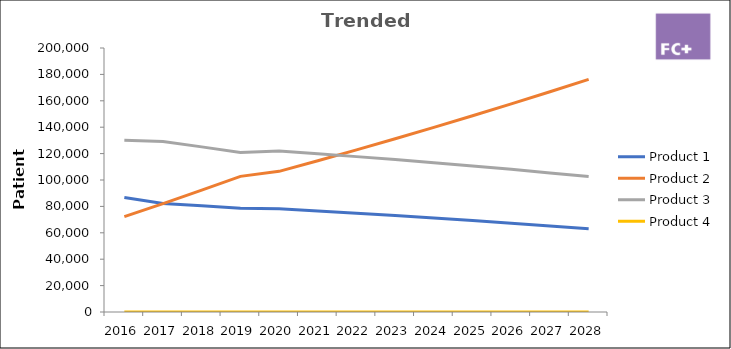
| Category | Product 1 | Product 2 | Product 3 | Product 4 |
|---|---|---|---|---|
| 2016.0 | 86708.516 | 72257.097 | 130062.774 | 0 |
| 2017.0 | 82159.853 | 82159.853 | 129108.34 | 0 |
| 2018.0 | 80413.48 | 92326.588 | 125087.636 | 0 |
| 2019.0 | 78579.115 | 102757.304 | 120890.945 | 0 |
| 2020.0 | 78189.891 | 106552.89 | 121884.242 | 0 |
| 2021.0 | 76564.402 | 114613.332 | 119848.948 | 0 |
| 2022.0 | 74861.185 | 122858.56 | 117706.596 | 0 |
| 2023.0 | 73080.241 | 131288.573 | 115457.186 | 0 |
| 2024.0 | 71221.57 | 139903.372 | 113100.718 | 0 |
| 2025.0 | 69285.171 | 148702.957 | 110637.191 | 0 |
| 2026.0 | 67271.046 | 157687.327 | 108066.605 | 0 |
| 2027.0 | 65179.192 | 166856.483 | 105388.962 | 0 |
| 2028.0 | 63009.612 | 176210.425 | 102604.26 | 0 |